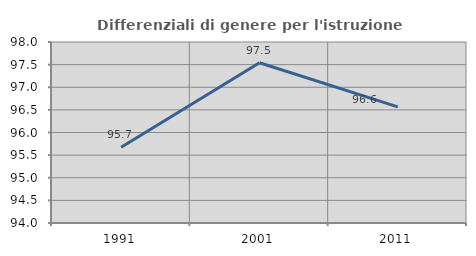
| Category | Differenziali di genere per l'istruzione superiore |
|---|---|
| 1991.0 | 95.672 |
| 2001.0 | 97.541 |
| 2011.0 | 96.566 |